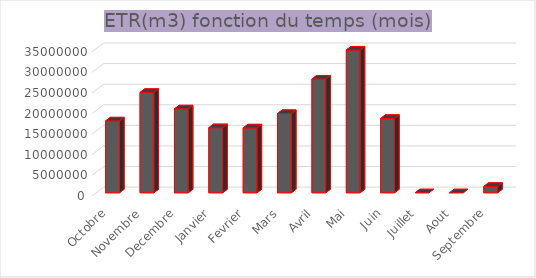
| Category | Series 0 |
|---|---|
| Octobre | 17460316 |
| Novembre | 24377371.2 |
| Decembre | 20379340.8 |
| Janvier | 15807052.8 |
| Fevrier | 15760431.792 |
| Mars | 19262880 |
| Avril | 27626988.816 |
| Mai | 34673184 |
| Juin | 18067317 |
| Juillet | 0 |
| Aout | 0 |
| Septembre | 1551749 |